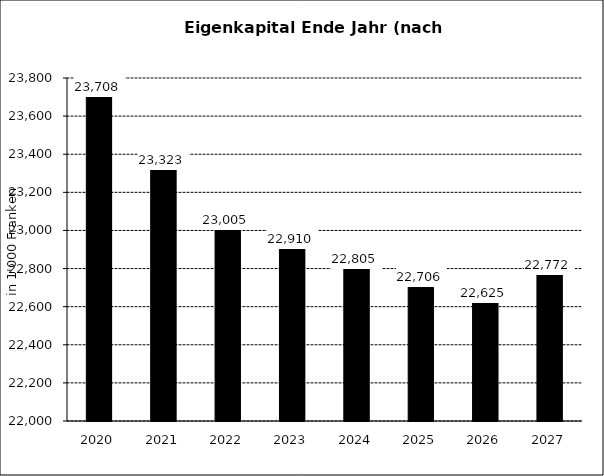
| Category | Eigenkapital Ende Jahr (nach Abschluss) |
|---|---|
| 2020.0 | 23708 |
| 2021.0 | 23323 |
| 2022.0 | 23005 |
| 2023.0 | 22910.362 |
| 2024.0 | 22805.109 |
| 2025.0 | 22706.067 |
| 2026.0 | 22625.276 |
| 2027.0 | 22772.05 |